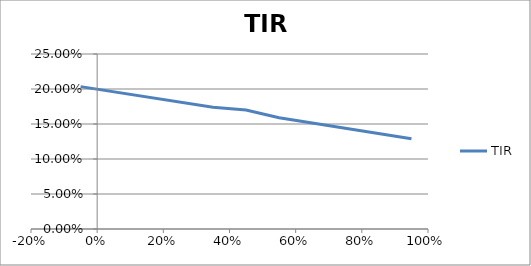
| Category | TIR |
|---|---|
| -0.05 | 0.203 |
| 0.35 | 0.174 |
| 0.45 | 0.17 |
| 0.55 | 0.159 |
| 0.65 | 0.151 |
| 0.95 | 0.129 |